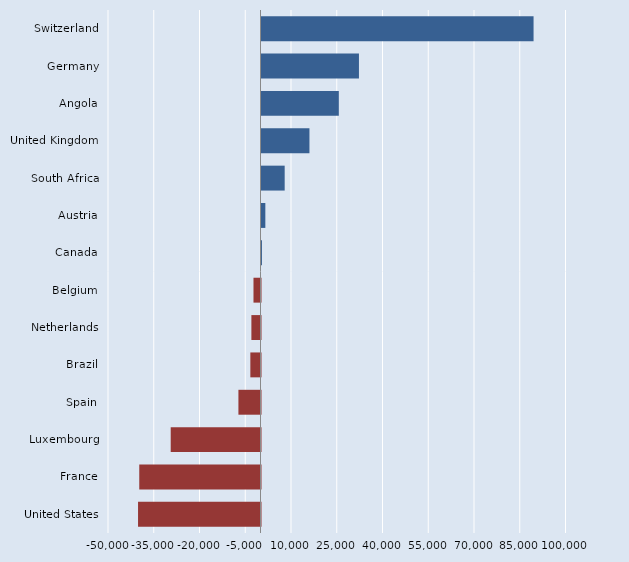
| Category | Series 0 |
|---|---|
| Switzerland | 89200 |
| Germany | 31950 |
| Angola | 25350 |
| United Kingdom | 15720 |
| South Africa | 7600 |
| Austria | 1260 |
| Canada | 100 |
| Belgium | -2300 |
| Netherlands | -2990 |
| Brazil | -3330 |
| Spain | -7240 |
| Luxembourg | -29440 |
| France | -39750 |
| United States | -40150 |